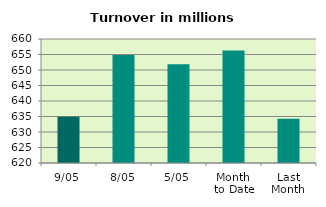
| Category | Series 0 |
|---|---|
| 9/05 | 634.926 |
| 8/05 | 654.845 |
| 5/05 | 651.89 |
| Month 
to Date | 656.302 |
| Last
Month | 634.312 |